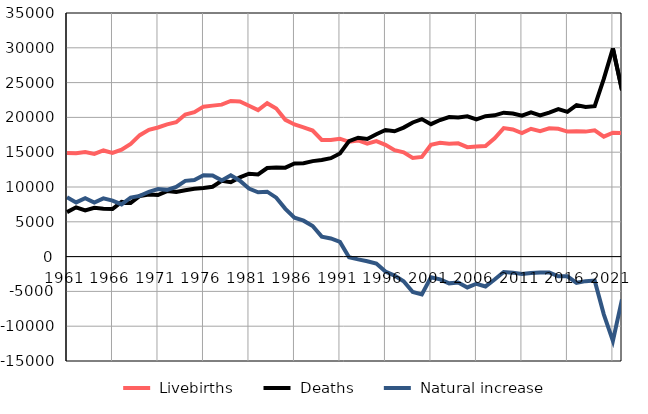
| Category |  Livebirths |  Deaths |  Natural increase |
|---|---|---|---|
| 1961.0 | 14900 | 6390 | 8510 |
| 1962.0 | 14865 | 7082 | 7783 |
| 1963.0 | 15020 | 6624 | 8396 |
| 1964.0 | 14760 | 7006 | 7754 |
| 1965.0 | 15251 | 6882 | 8369 |
| 1966.0 | 14885 | 6834 | 8051 |
| 1967.0 | 15353 | 7860 | 7493 |
| 1968.0 | 16198 | 7711 | 8487 |
| 1969.0 | 17447 | 8718 | 8729 |
| 1970.0 | 18221 | 8910 | 9311 |
| 1971.0 | 18550 | 8850 | 9700 |
| 1972.0 | 18997 | 9409 | 9588 |
| 1973.0 | 19312 | 9301 | 10011 |
| 1974.0 | 20412 | 9532 | 10880 |
| 1975.0 | 20746 | 9740 | 11006 |
| 1976.0 | 21546 | 9867 | 11679 |
| 1977.0 | 21693 | 10039 | 11654 |
| 1978.0 | 21830 | 10879 | 10951 |
| 1979.0 | 22361 | 10687 | 11674 |
| 1980.0 | 22277 | 11374 | 10903 |
| 1981.0 | 21671 | 11904 | 9767 |
| 1982.0 | 21049 | 11808 | 9241 |
| 1983.0 | 22047 | 12721 | 9326 |
| 1984.0 | 21280 | 12812 | 8468 |
| 1985.0 | 19645 | 12783 | 6862 |
| 1986.0 | 18980 | 13380 | 5600 |
| 1987.0 | 18580 | 13418 | 5162 |
| 1988.0 | 18106 | 13719 | 4387 |
| 1989.0 | 16756 | 13881 | 2875 |
| 1990.0 | 16740 | 14137 | 2603 |
| 1991.0 | 16942 | 14824 | 2118 |
| 1992.0 | 16496 | 16589 | -93 |
| 1993.0 | 16685 | 17084 | -399 |
| 1994.0 | 16238 | 16901 | -663 |
| 1995.0 | 16590 | 17586 | -996 |
| 1996.0 | 16052 | 18197 | -2145 |
| 1997.0 | 15284 | 18012 | -2728 |
| 1998.0 | 14987 | 18533 | -3546 |
| 1999.0 | 14182 | 19274 | -5092 |
| 2000.0 | 14324 | 19758 | -5434 |
| 2001.0 | 16059 | 19025 | -2966 |
| 2002.0 | 16342 | 19621 | -3279 |
| 2003.0 | 16200 | 20045 | -3845 |
| 2004.0 | 16276 | 19993 | -3717 |
| 2005.0 | 15727 | 20155 | -4428 |
| 2006.0 | 15802 | 19703 | -3901 |
| 2007.0 | 15887 | 20174 | -4287 |
| 2008.0 | 17000 | 20294 | -3294 |
| 2009.0 | 18463 | 20682 | -2219 |
| 2010.0 | 18262 | 20566 | -2304 |
| 2011.0 | 17738 | 20246 | -2508 |
| 2012.0 | 18362 | 20725 | -2363 |
| 2013.0 | 18018 | 20288 | -2270 |
| 2014.0 | 18427 | 20698 | -2271 |
| 2015.0 | 18356 | 21196 | -2840 |
| 2016.0 | 17967 | 20803 | -2836 |
| 2017.0 | 18000 | 21768 | -3768 |
| 2018.0 | 17959 | 21484 | -3525 |
| 2019.0 | 18153 | 21604 | -3451 |
| 2020.0 | 17236 | 25526 | -8290 |
| 2021.0 | 17803 | 29917 | -12114 |
| 2022.0 | 17753 | 23912 | -6159 |